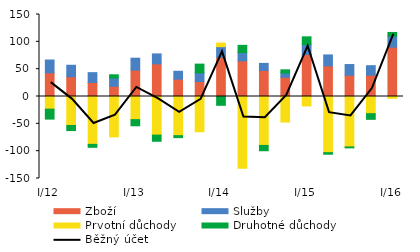
| Category | Zboží | Služby | Prvotní důchody | Druhotné důchody |
|---|---|---|---|---|
| I/12 | 43.281 | 23.478 | -23.083 | -18.258 |
| II | 36.152 | 20.972 | -52.981 | -9.36 |
| III | 25.681 | 17.923 | -87.565 | -5.364 |
| IV | 18.683 | 15.252 | -73.899 | 5.772 |
| I/13 | 48.355 | 21.702 | -42.281 | -11.28 |
| II | 59.692 | 18.186 | -70.624 | -11.218 |
| III | 31.672 | 14.458 | -71.638 | -3.56 |
| IV | 27.254 | 16.013 | -64.475 | 15.96 |
| I/14 | 71.525 | 19.636 | 6.653 | -16.093 |
| II | 65.182 | 15.226 | -131.27 | 13.191 |
| III | 47.73 | 12.825 | -89.485 | -9.728 |
| IV | 35.101 | 7.964 | -46.676 | 5.699 |
| I/15 | 76.87 | 18.007 | -17.262 | 14.268 |
| II | 56.045 | 20.023 | -102.674 | -2.957 |
| III | 38.874 | 19.58 | -92.216 | -1.788 |
| IV | 38.938 | 17.433 | -31.364 | -10.405 |
| I/16 | 90.264 | 20.096 | -3.34 | 6.786 |